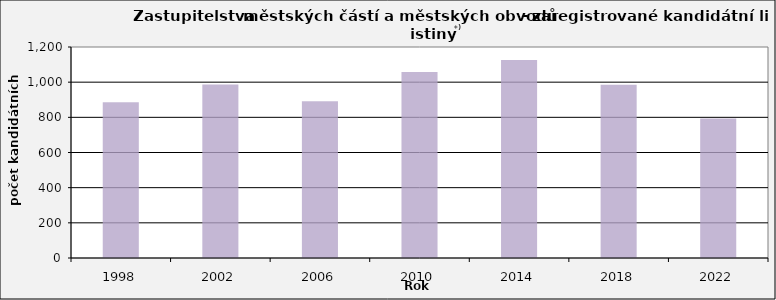
| Category | Počet kandidátních listin |
|---|---|
| 1998.0 | 886 |
| 2002.0 | 987 |
| 2006.0 | 892 |
| 2010.0 | 1058 |
| 2014.0 | 1126 |
| 2018.0 | 985 |
| 2022.0 | 794 |